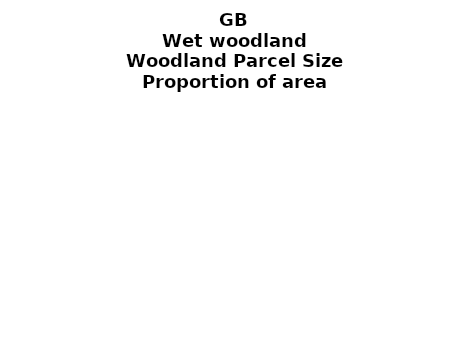
| Category | Wet woodland |
|---|---|
| <5 ha | 0.279 |
| ≥5 and <10 ha | 0.099 |
| ≥10 and <15 ha | 0.067 |
| ≥15 and <20 ha | 0.047 |
| ≥20 and <25 ha | 0.024 |
| ≥25 and <30 ha | 0.032 |
| ≥30 and <35 ha | 0.021 |
| ≥35 and <40 ha | 0.013 |
| ≥40 and <45 ha | 0.014 |
| ≥45 and <50 ha | 0.017 |
| ≥50 and <60 ha | 0.022 |
| ≥60 and <70 ha | 0.022 |
| ≥70 and <80 ha | 0.029 |
| ≥80 and <90 ha | 0.013 |
| ≥90 and <100 ha | 0.01 |
| ≥100 and <150 ha | 0.044 |
| ≥150 and <200 ha | 0.025 |
| ≥200 ha | 0.221 |